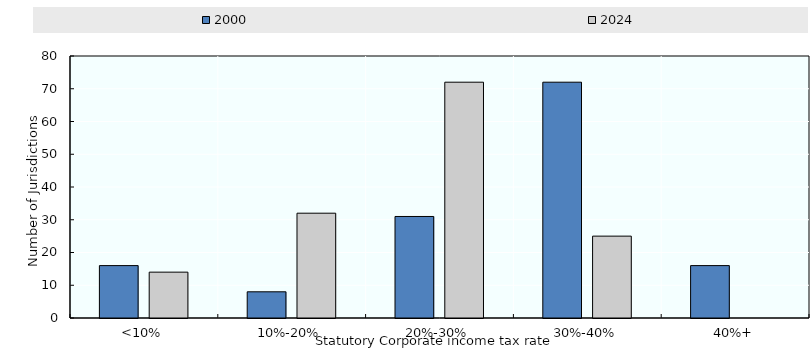
| Category | 2000 | 2024 |
|---|---|---|
| <10% | 16 | 14 |
| 10%-20% | 8 | 32 |
| 20%-30% | 31 | 72 |
| 30%-40% | 72 | 25 |
| 40%+ | 16 | 0 |